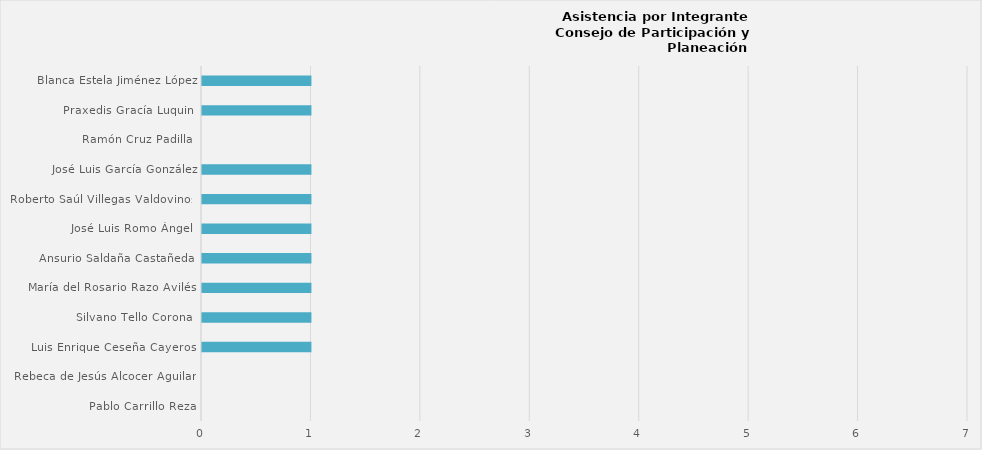
| Category | Series 0 |
|---|---|
| Pablo Carrillo Reza | 0 |
| Rebeca de Jesús Alcocer Aguilar  | 0 |
| Luis Enrique Ceseña Cayeros  | 1 |
| Silvano Tello Corona  | 1 |
| María del Rosario Razo Avilés  | 1 |
| Ansurio Saldaña Castañeda  | 1 |
| José Luis Romo Ángel  | 1 |
| Roberto Saúl Villegas Valdovinos  | 1 |
| José Luis García González | 1 |
| Ramón Cruz Padilla  | 0 |
| Praxedis Gracía Luquin  | 1 |
| Blanca Estela Jiménez López | 1 |